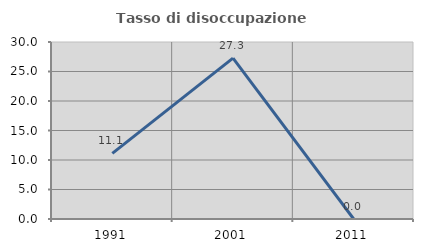
| Category | Tasso di disoccupazione giovanile  |
|---|---|
| 1991.0 | 11.111 |
| 2001.0 | 27.273 |
| 2011.0 | 0 |